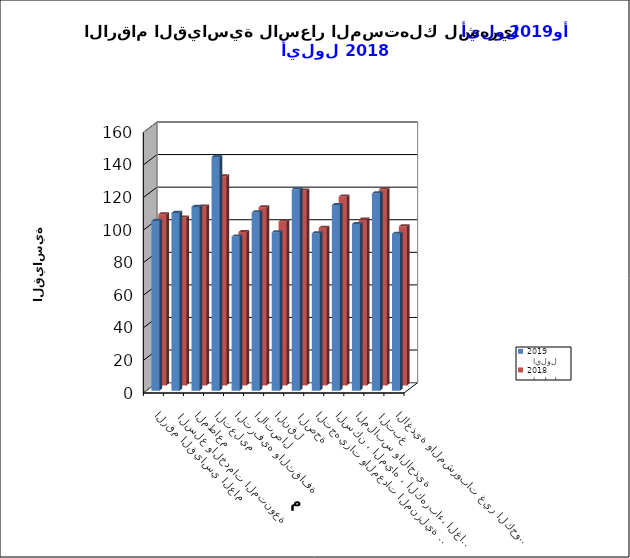
| Category |   ايلول     2019      |   ايلول     2018 |
|---|---|---|
| الاغذية والمشروبات غير الكحولية | 96.3 | 97.7 |
|  التبغ | 121.1 | 120.3 |
| الملابس والاحذية | 102.3 | 101.8 |
| السكن ، المياه ، الكهرباء، الغاز  | 113.9 | 116 |
| التجهيزات والمعدات المنزلية والصيانة | 96.6 | 96.8 |
|  الصحة | 123.6 | 119.7 |
| النقل | 97.2 | 100.7 |
| الاتصال | 109.4 | 109.4 |
| الترفيه والثقافة | 94.6 | 94.2 |
| التعليم | 143.5 | 128.4 |
| المطاعم  | 112.8 | 109.8 |
|  السلع والخدمات المتنوعة | 109.1 | 103.1 |
| الرقم القياسي العام | 104.2 | 105.1 |